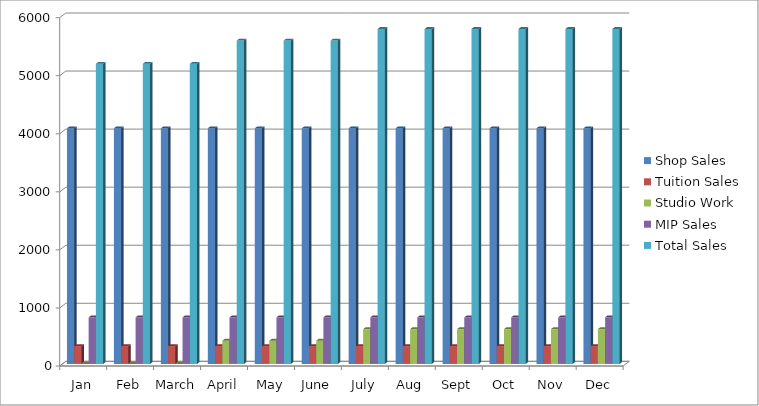
| Category | Shop Sales | Tuition Sales | Studio Work | MIP Sales | Total Sales |
|---|---|---|---|---|---|
| Jan | 4059 | 308 | 0 | 803 | 5170 |
| Feb | 4059 | 308 | 0 | 803 | 5170 |
| March | 4059 | 308 | 0 | 803 | 5170 |
| April | 4059 | 308 | 400 | 803 | 5570 |
| May | 4059 | 308 | 400 | 803 | 5570 |
| June | 4059 | 308 | 400 | 803 | 5570 |
| July | 4059 | 308 | 600 | 803 | 5770 |
| Aug | 4059 | 308 | 600 | 803 | 5770 |
| Sept | 4059 | 308 | 600 | 803 | 5770 |
| Oct | 4059 | 308 | 600 | 803 | 5770 |
| Nov | 4059 | 308 | 600 | 803 | 5770 |
| Dec | 4059 | 308 | 600 | 803 | 5770 |